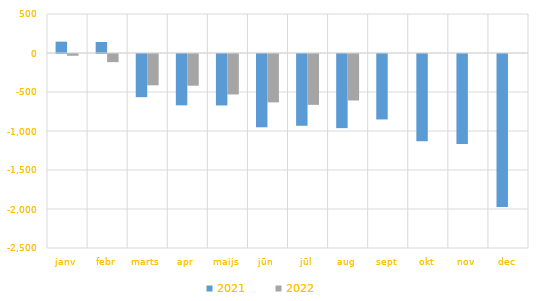
| Category | 2021 | 2022 |
|---|---|---|
| janv | 145495.451 | -22576.613 |
| febr | 140973.019 | -104207.657 |
| marts | -553552.963 | -401343.883 |
| apr | -658430.761 | -406432.786 |
| maijs | -659587.172 | -518798.917 |
| jūn | -939419.413 | -620133.729 |
| jūl | -920391.102 | -652119.984 |
| aug | -950438.335 | -596051.014 |
| sept | -838941.258 | 0 |
| okt | -1117742.949 | 0 |
| nov | -1155026.676 | 0 |
| dec | -1960876.794 | 0 |